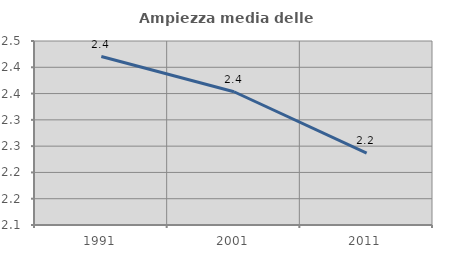
| Category | Ampiezza media delle famiglie |
|---|---|
| 1991.0 | 2.42 |
| 2001.0 | 2.353 |
| 2011.0 | 2.237 |